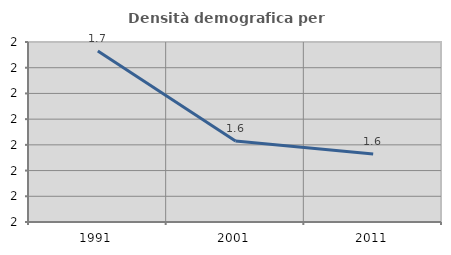
| Category | Densità demografica |
|---|---|
| 1991.0 | 1.673 |
| 2001.0 | 1.603 |
| 2011.0 | 1.593 |